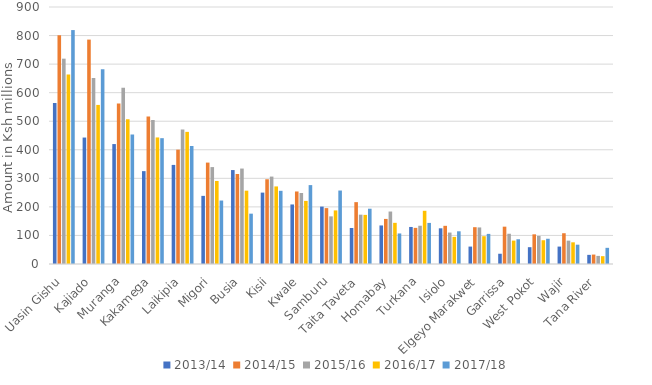
| Category | 2013/14 | 2014/15 | 2015/16 | 2016/17 | 2017/18  |
|---|---|---|---|---|---|
| Uasin Gishu | 563.7 | 800.824 | 719.042 | 663.831 | 819.22 |
| Kajiado | 442.8 | 785.838 | 650.985 | 557.094 | 682.163 |
| Muranga | 420 | 562.228 | 617.526 | 506.686 | 453.707 |
| Kakamega | 325.2 | 516.889 | 504.238 | 443.176 | 440.611 |
| Laikipia | 347 | 400.485 | 471.148 | 462.723 | 413.328 |
| Migori | 238.6 | 355.112 | 339.369 | 290.815 | 222.251 |
| Busia | 329 | 315.202 | 334.222 | 256.826 | 176.295 |
| Kisii | 250 | 296.771 | 306.13 | 271.644 | 256.285 |
| Kwale | 208.5 | 253.972 | 248.618 | 221.011 | 276.295 |
| Samburu | 201 | 195.715 | 166.836 | 187.664 | 257.293 |
| Taita Taveta | 126 | 216.604 | 172.766 | 172.017 | 193.596 |
| Homabay | 135 | 157.86 | 183.765 | 144.132 | 106.939 |
| Turkana | 129.7 | 126.525 | 134.016 | 186.317 | 143.897 |
| Isiolo | 125 | 133.699 | 110.108 | 94.996 | 114.557 |
| Elgeyo Marakwet | 61 | 128.906 | 128.056 | 97.324 | 105.483 |
| Garrissa | 35.9 | 130.718 | 105.944 | 81.958 | 86.688 |
| West Pokot | 58.9 | 103.899 | 98.305 | 83.219 | 88.411 |
| Wajir | 61 | 107.743 | 81.782 | 75.909 | 67.608 |
| Tana River | 32 | 33.033 | 28.405 | 27.417 | 56.625 |